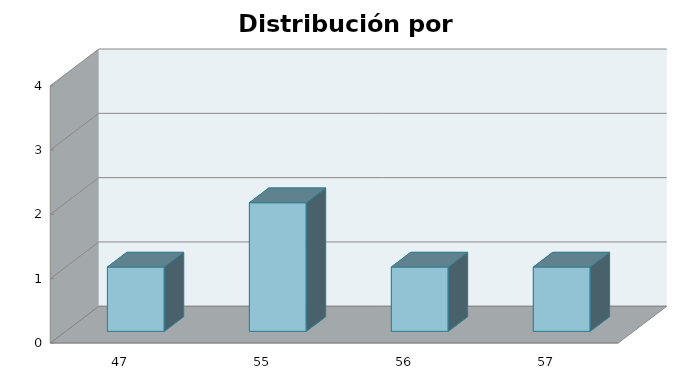
| Category | Series 1 |
|---|---|
| 47.0 | 1 |
| 55.0 | 2 |
| 56.0 | 1 |
| 57.0 | 1 |